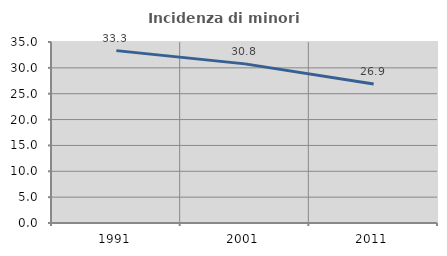
| Category | Incidenza di minori stranieri |
|---|---|
| 1991.0 | 33.333 |
| 2001.0 | 30.769 |
| 2011.0 | 26.882 |